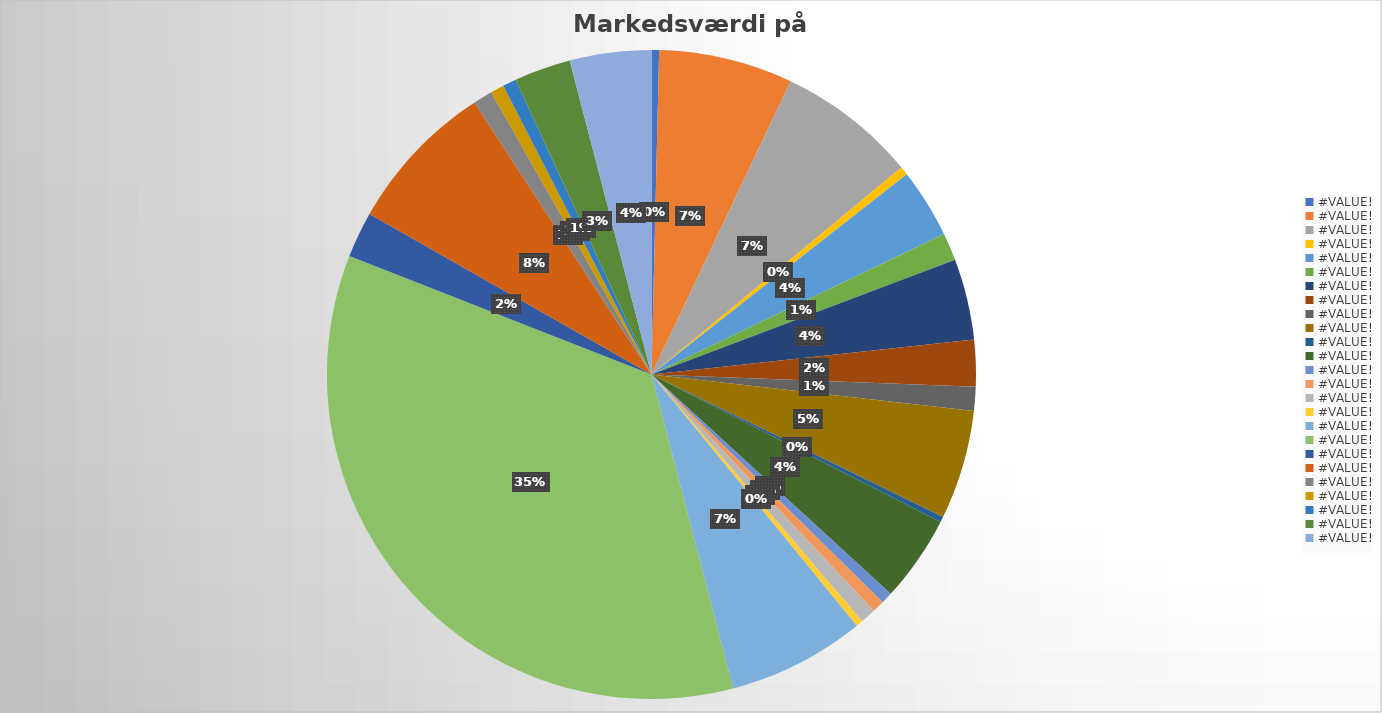
| Category | Series 0 |
|---|---|
| Ambu A/S (XCSE:AMBU B) | 14073973200 |
| AP Moeller - Maersk A/S (XCSE:MAERSK A) | 249179371200 |
| AP Moeller - Maersk A/S (XCSE:MAERSK B) | 258813558600 |
| Bavarian Nordic A/S (XCSE:BAVA) | 15609305856 |
| Carlsberg A/S (XCSE:CARL B) | 129373401600 |
| Chr Hansen Holding A/S (XCSE:CHR) | 51158770000 |
| Coloplast A/S (XCSE:COLO B) | 150480000000 |
| Danske Bank A/S (XCSE:DANSKE) | 86563333840 |
| Demant A/S (XCSE:DEMANT) | 44555240580 |
| DSV A/S (XCSE:DSV) | 203252400000 |
| FLSmidth & Co A/S (XCSE:FLS) | 10054160000 |
| Genmab A/S (XCSE:GMAB) | 160578547200 |
| GN Store Nord A/S (XCSE:GN) | 21093485250 |
| Iss A/S (XCSE:ISS) | 22595819940 |
| Jyske Bank A/S (XCSE:JYSK) | 28669500000 |
| Netcompany Group A/S (XCSE:NETC) | 13040000000 |
| Nordea Bank Abp (XCSE:NDA DK) | 255688488120 |
| Novo Nordisk A/S (XCSE:NOVO B) | 1305703205200 |
| Novozymes A/S (XCSE:NZYM B) | 85289326920 |
| Orsted A/S (XCSE:ORSTED) | 283000556520 |
| Pandora A/S (XCSE:PNDORA) | 35802950000 |
| Rockwool A/S (XCSE:ROCK B) | 25036782180 |
| Royal Unibrew A/S (XCSE:RBREW) | 25310840000 |
| Tryg A/S (XCSE:TRYG) | 105137432400 |
| Vestas Wind Systems A/S (XCSE:VWS) | 151338668620 |